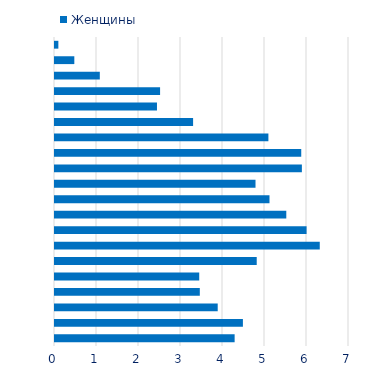
| Category |  Женщины  |
|---|---|
| 0-4 | 4.277 |
| 5-9 | 4.474 |
| 10-14 | 3.874 |
| 15-19 | 3.448 |
| 20-24 | 3.434 |
| 25-29 | 4.803 |
| 30-34 | 6.304 |
| 35-39 | 5.99 |
| 40-44 | 5.507 |
| 45-49 | 5.107 |
| 50-54 | 4.774 |
| 55-59 | 5.878 |
| 60-64 | 5.863 |
| 65-69 | 5.081 |
| 70-74 | 3.288 |
| 75-79 | 2.428 |
| 80-84 | 2.502 |
| 85-89 | 1.067 |
| 90-94 | 0.46 |
| 95-99 | 0.08 |